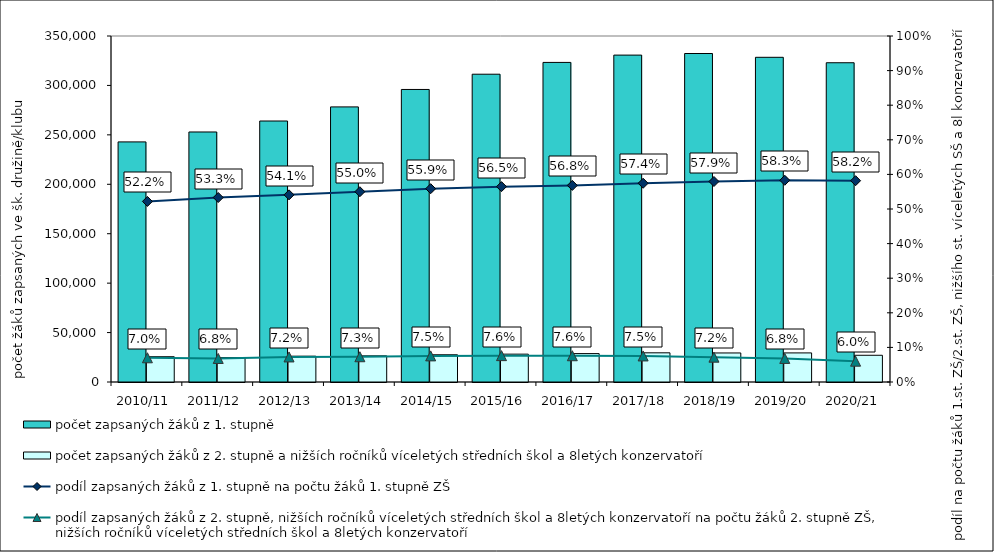
| Category | počet zapsaných žáků z 1. stupně | počet zapsaných žáků z 2. stupně a nižších ročníků víceletých středních škol a 8letých konzervatoří |
|---|---|---|
| 2010/11 | 242881 | 25583 |
| 2011/12 | 252913 | 24599 |
| 2012/13 | 264017 | 26123 |
| 2013/14 | 278280 | 26456 |
| 2014/15 | 295914 | 27561 |
| 2015/16 | 311354 | 28171 |
| 2016/17 | 323277 | 28726 |
| 2017/18 | 330679 | 29512 |
| 2018/19 | 332286 | 29367 |
| 2019/20 | 328452 | 29415 |
| 2020/21 | 322944 | 27037 |